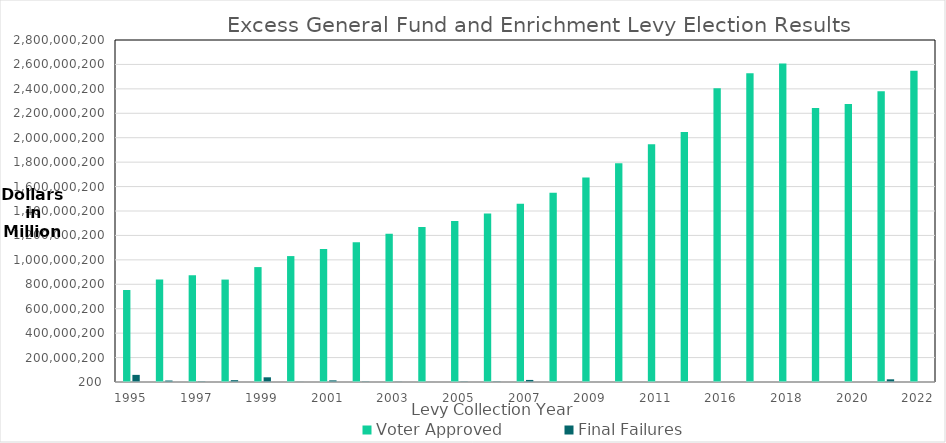
| Category | Voter Approved | Final Failures |
|---|---|---|
| 1995 | 753041982 | 58324310 |
| 1996 | 839318107 | 12089175 |
| 1997 | 874789668 | 3765443 |
| 1998 | 838604584 | 15047453 |
| 1999 | 940765937 | 38481902 |
| 2000 | 1030873759 | 1268399 |
| 2001 | 1088088126 | 13438599 |
| 2002 | 1143919081 | 3533559 |
| 2003 | 1212816864 | 1907738 |
| 2004 | 1268819341 | 482851 |
| 2005 | 1317841524 | 3338000 |
| 2006 | 1380248875 | 3947759 |
| 2007 | 1459700998 | 16940636 |
| 2008 | 1549670919 | 225000 |
| 2009 | 1674487111 | 347952 |
| 2010 | 1791463918 | 349181 |
| 2011 | 1945703236 | 0 |
| 2012 | 2046703841 | 245000 |
| 2016 | 2405746819 | 117000 |
| 2017 | 2527706168 | 0 |
| 2018 | 2606634102 | 0 |
| 2019 | 2243795589 | 0 |
| 2020 | 2276315760 | 0 |
| 2021 | 2380406000 | 22016023 |
| 2022 | 2547417684 | 0 |